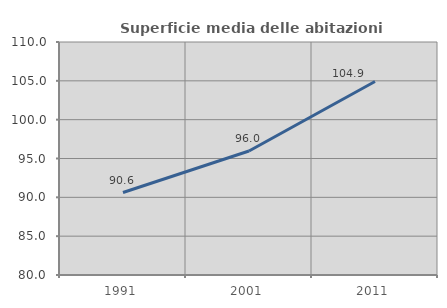
| Category | Superficie media delle abitazioni occupate |
|---|---|
| 1991.0 | 90.616 |
| 2001.0 | 95.966 |
| 2011.0 | 104.918 |